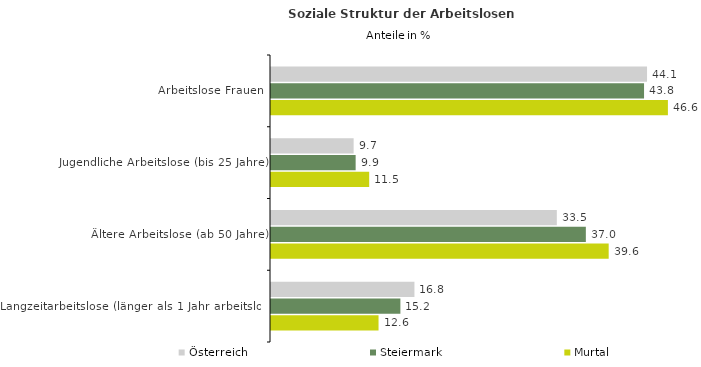
| Category | Österreich | Steiermark | Murtal |
|---|---|---|---|
| Arbeitslose Frauen | 44.136 | 43.785 | 46.585 |
| Jugendliche Arbeitslose (bis 25 Jahre) | 9.698 | 9.935 | 11.524 |
| Ältere Arbeitslose (ab 50 Jahre) | 33.548 | 36.954 | 39.634 |
| Langzeitarbeitslose (länger als 1 Jahr arbeitslos) | 16.836 | 15.186 | 12.622 |